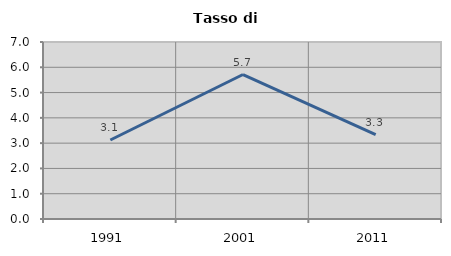
| Category | Tasso di disoccupazione   |
|---|---|
| 1991.0 | 3.125 |
| 2001.0 | 5.714 |
| 2011.0 | 3.333 |